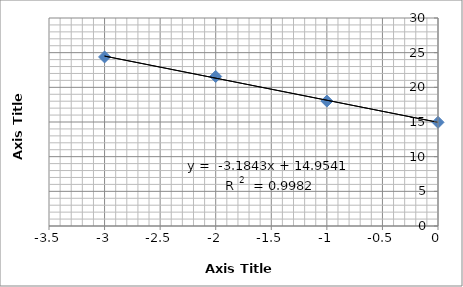
| Category | Series 0 |
|---|---|
| 0.0 | 14.954 |
| -1.0 | 18.016 |
| -2.0 | 21.567 |
| -3.0 | 24.385 |